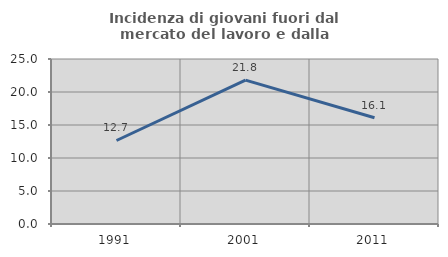
| Category | Incidenza di giovani fuori dal mercato del lavoro e dalla formazione  |
|---|---|
| 1991.0 | 12.653 |
| 2001.0 | 21.801 |
| 2011.0 | 16.102 |